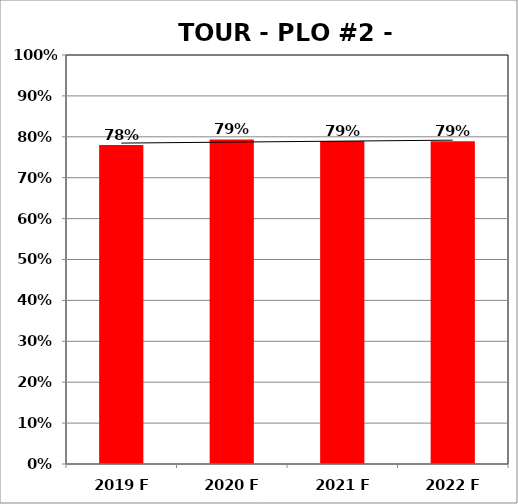
| Category | Series 0 |
|---|---|
| 2019 F | 0.78 |
| 2020 F | 0.794 |
| 2021 F | 0.79 |
| 2022 F | 0.789 |